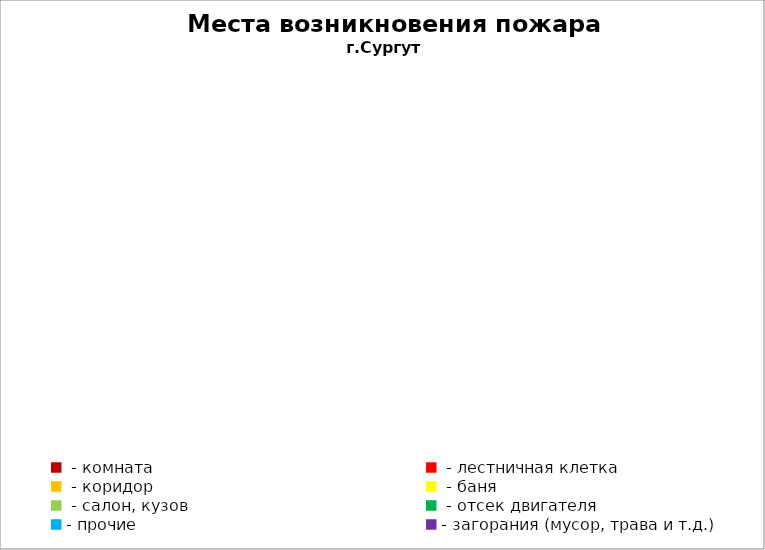
| Category | Места возникновения пожара |
|---|---|
|  - комната | 37 |
|  - лестничная клетка | 11 |
|  - коридор | 5 |
|  - баня | 11 |
|  - салон, кузов | 4 |
|  - отсек двигателя | 10 |
| - прочие | 42 |
| - загорания (мусор, трава и т.д.)  | 71 |